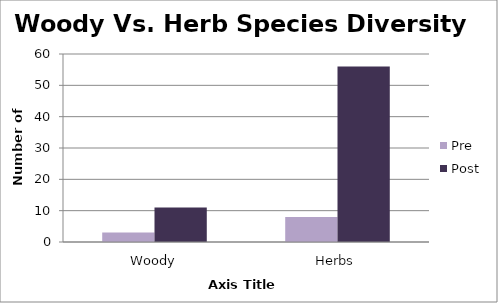
| Category | Pre | Post |
|---|---|---|
| Woody | 3 | 11 |
| Herbs | 8 | 56 |